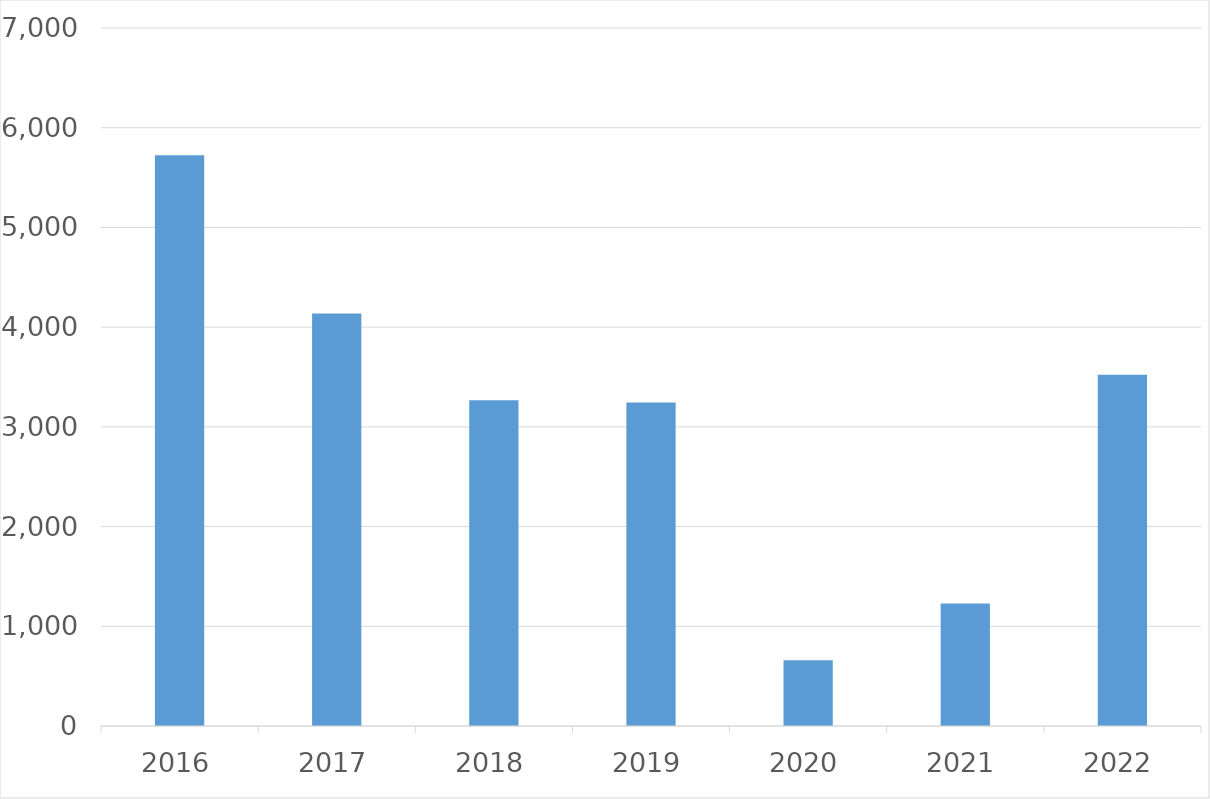
| Category | Series 0 |
|---|---|
| 2016 | 5725 |
| 2017 | 4138 |
| 2018 | 3267 |
| 2019 | 3245 |
| 2020 | 659 |
| 2021 | 1229 |
| 2022 | 3523 |